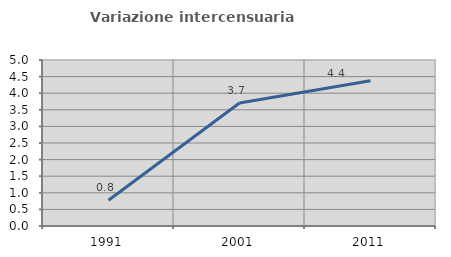
| Category | Variazione intercensuaria annua |
|---|---|
| 1991.0 | 0.775 |
| 2001.0 | 3.707 |
| 2011.0 | 4.375 |